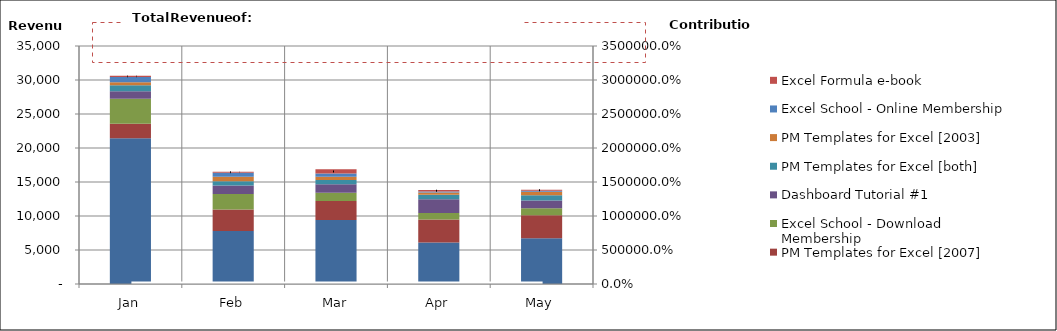
| Category | Excel School - Dashboards Membership | PM Templates for Excel [2007] | Excel School - Download Membership | Dashboard Tutorial #1 | PM Templates for Excel [both] | PM Templates for Excel [2003] | Excel School - Online Membership | Excel Formula e-book |
|---|---|---|---|---|---|---|---|---|
|  Jan  | 21422.1 | 2130 | 3702.75 | 1073 | 900 | 450 | 774 | 160 |
|  Feb  | 7795.2 | 3151.47 | 2302.5 | 1221 | 630 | 660 | 602 | 150 |
|  Mar  | 9414.84 | 2791.21 | 1216.6 | 1258 | 615 | 480 | 462.3 | 620 |
|  Apr  | 6120.9 | 3360 | 970 | 2027.6 | 630 | 360 | 134 | 230 |
|  May  | 6718.6 | 3390 | 1037.9 | 1128 | 765 | 540 | 134 | 150 |